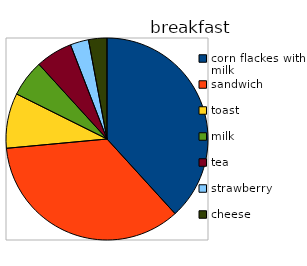
| Category | Series 0 |
|---|---|
| corn flackes with milk | 13 |
| sandwich | 12 |
| toast | 3 |
| milk | 2 |
| tea | 2 |
| strawberry | 1 |
| cheese | 1 |